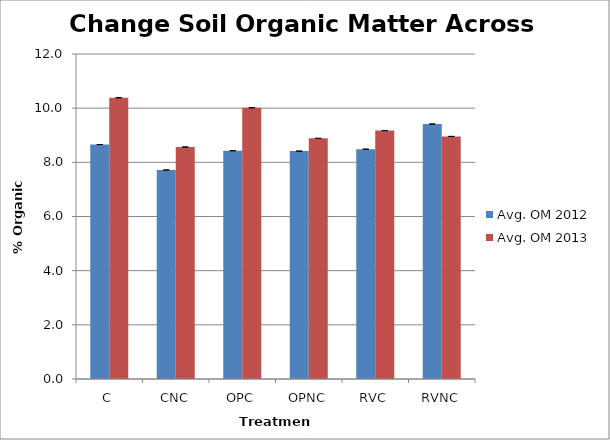
| Category | Avg. OM 2012 | Avg. OM 2013 |
|---|---|---|
| C | 8.657 | 10.386 |
| CNC | 7.717 | 8.567 |
| OPC | 8.429 | 10.017 |
| OPNC | 8.414 | 8.886 |
| RVC | 8.486 | 9.171 |
| RVNC | 9.414 | 8.957 |